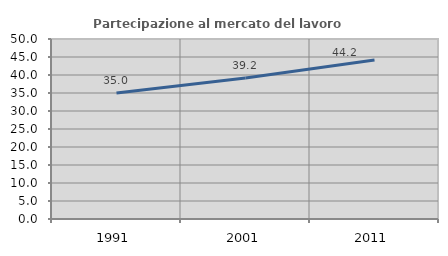
| Category | Partecipazione al mercato del lavoro  femminile |
|---|---|
| 1991.0 | 35.022 |
| 2001.0 | 39.154 |
| 2011.0 | 44.188 |